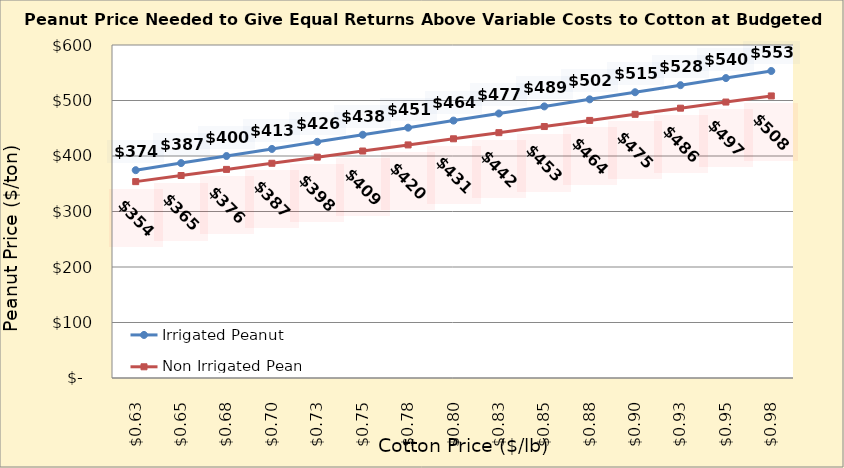
| Category | Irrigated Peanut | Non Irrigated Peanut |
|---|---|---|
| 0.6249999999999999 | 374.451 | 353.811 |
| 0.6499999999999999 | 387.217 | 364.841 |
| 0.6749999999999999 | 399.983 | 375.87 |
| 0.7 | 412.749 | 386.899 |
| 0.725 | 425.515 | 397.929 |
| 0.75 | 438.281 | 408.958 |
| 0.775 | 451.047 | 419.988 |
| 0.8 | 463.813 | 431.017 |
| 0.8250000000000001 | 476.578 | 442.046 |
| 0.8500000000000001 | 489.344 | 453.076 |
| 0.8750000000000001 | 502.11 | 464.105 |
| 0.9000000000000001 | 514.876 | 475.135 |
| 0.9250000000000002 | 527.642 | 486.164 |
| 0.9500000000000002 | 540.408 | 497.193 |
| 0.9750000000000002 | 553.174 | 508.223 |